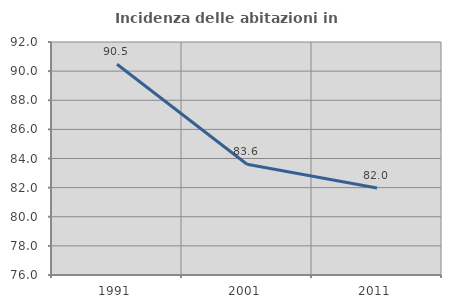
| Category | Incidenza delle abitazioni in proprietà  |
|---|---|
| 1991.0 | 90.476 |
| 2001.0 | 83.604 |
| 2011.0 | 81.978 |